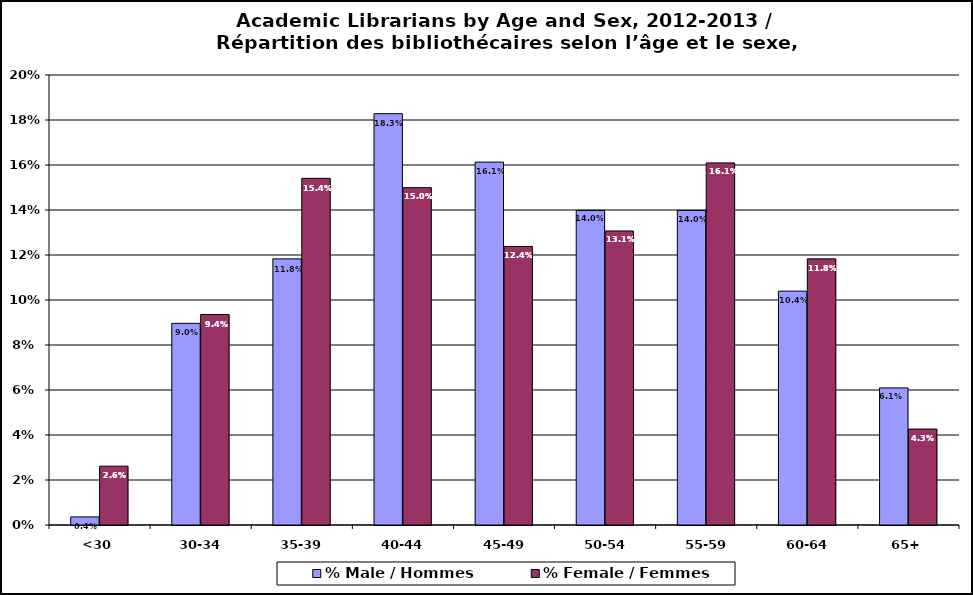
| Category | % Male / Hommes | % Female / Femmes |
|---|---|---|
| <30 | 0.004 | 0.026 |
| 30-34 | 0.09 | 0.094 |
| 35-39 | 0.118 | 0.154 |
| 40-44 | 0.183 | 0.15 |
| 45-49 | 0.161 | 0.124 |
| 50-54 | 0.14 | 0.131 |
| 55-59 | 0.14 | 0.161 |
| 60-64 | 0.104 | 0.118 |
| 65+ | 0.061 | 0.043 |